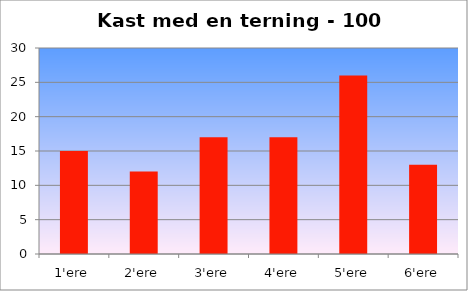
| Category | Frekvens |
|---|---|
| 1'ere | 15 |
| 2'ere | 12 |
| 3'ere | 17 |
| 4'ere | 17 |
| 5'ere | 26 |
| 6'ere | 13 |